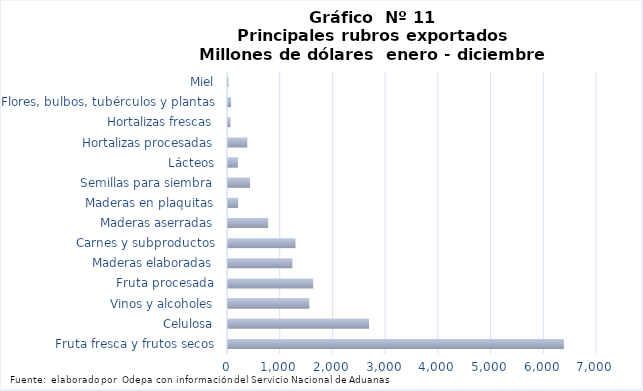
| Category | Series 7 |
|---|---|
| Fruta fresca y frutos secos | 6371527.372 |
| Celulosa | 2675962.65 |
| Vinos y alcoholes | 1541941.065 |
| Fruta procesada | 1616189.222 |
| Maderas elaboradas | 1220506.975 |
| Carnes y subproductos | 1280654.443 |
| Maderas aserradas | 761287.044 |
| Maderas en plaquitas | 193396.933 |
| Semillas para siembra | 418703.357 |
| Lácteos | 187280.693 |
| Hortalizas procesadas | 365759.937 |
| Hortalizas frescas | 47084.468 |
| Flores, bulbos, tubérculos y plantas | 57708.184 |
| Miel | 9968.312 |